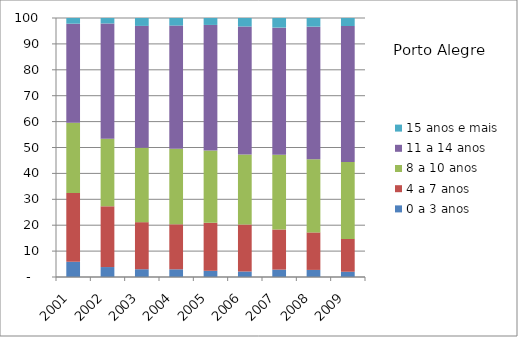
| Category | 0 a 3 anos | 4 a 7 anos | 8 a 10 anos | 11 a 14 anos | 15 anos e mais |
|---|---|---|---|---|---|
| 2001.0 | 5.87 | 26.52 | 27.18 | 38.23 | 2.19 |
| 2002.0 | 3.84 | 23.46 | 26.12 | 44.47 | 2.11 |
| 2003.0 | 3 | 18.18 | 28.7 | 47.08 | 3.04 |
| 2004.0 | 2.97 | 17.37 | 29.15 | 47.59 | 2.92 |
| 2005.0 | 2.39 | 18.55 | 27.89 | 48.49 | 2.68 |
| 2006.0 | 2.13 | 18.13 | 26.99 | 49.47 | 3.28 |
| 2007.0 | 2.85 | 15.49 | 28.85 | 49.09 | 3.71 |
| 2008.0 | 2.74 | 14.48 | 28.22 | 51.22 | 3.34 |
| 2009.0 | 2.03 | 12.68 | 29.73 | 52.46 | 3.1 |